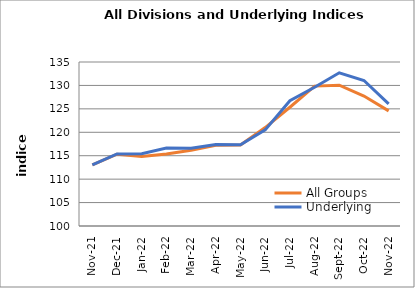
| Category | All Groups | Underlying |
|---|---|---|
| 2021-11-01 | 113.04 | 113.069 |
| 2021-12-01 | 115.331 | 115.373 |
| 2022-01-01 | 114.841 | 115.444 |
| 2022-02-01 | 115.348 | 116.622 |
| 2022-03-01 | 116.161 | 116.584 |
| 2022-04-01 | 117.224 | 117.408 |
| 2022-05-01 | 117.307 | 117.326 |
| 2022-06-01 | 121.013 | 120.516 |
| 2022-07-01 | 125.348 | 126.726 |
| 2022-08-01 | 129.854 | 129.6 |
| 2022-09-01 | 130.056 | 132.699 |
| 2022-10-01 | 127.726 | 131.059 |
| 2022-11-01 | 124.568 | 126.047 |